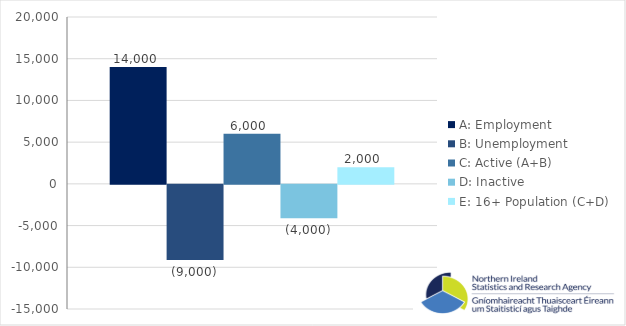
| Category | A: Employment | B: Unemployment | C: Active (A+B) | D: Inactive | E: 16+ Population (C+D) |
|---|---|---|---|---|---|
| 0 | 14000 | -9000 | 6000 | -4000 | 2000 |